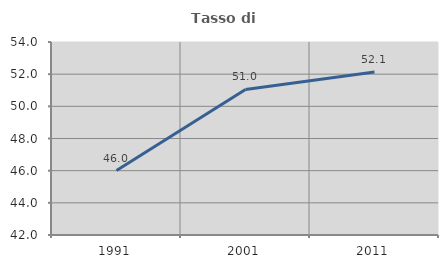
| Category | Tasso di occupazione   |
|---|---|
| 1991.0 | 46.005 |
| 2001.0 | 51.047 |
| 2011.0 | 52.137 |